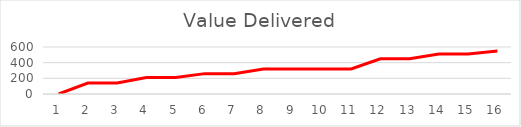
| Category | Series 0 |
|---|---|
| 0 | 0 |
| 1 | 140 |
| 2 | 140 |
| 3 | 210 |
| 4 | 210 |
| 5 | 260 |
| 6 | 260 |
| 7 | 320 |
| 8 | 320 |
| 9 | 320 |
| 10 | 320 |
| 11 | 450 |
| 12 | 450 |
| 13 | 510 |
| 14 | 510 |
| 15 | 550 |